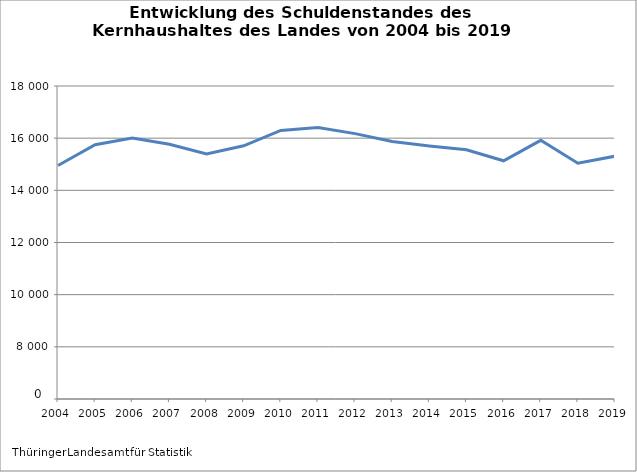
| Category | Series 0 | Series 1 |
|---|---|---|
| 2004 | 0 | 14953985 |
| 2005 | 0 | 15748208 |
| 2006 | 0 | 16004524 |
| 2007 | 0 | 15766974 |
| 2008 | 0 | 15398540 |
| 2009 | 0 | 15706870 |
| 2010 | 0 | 16295564 |
| 2011 | 0 | 16411400 |
| 2012 | 0 | 16174711.937 |
| 2013 | 2013 | 15874154 |
| 2014 | 2014 | 15699304 |
| 2015 | 0 | 15555004 |
| 2016 | 2016 | 15133688 |
| 2017 | 0 | 15916908 |
| 2018 | 2018 | 15041750 |
| 2019 | 0 | 15308518 |